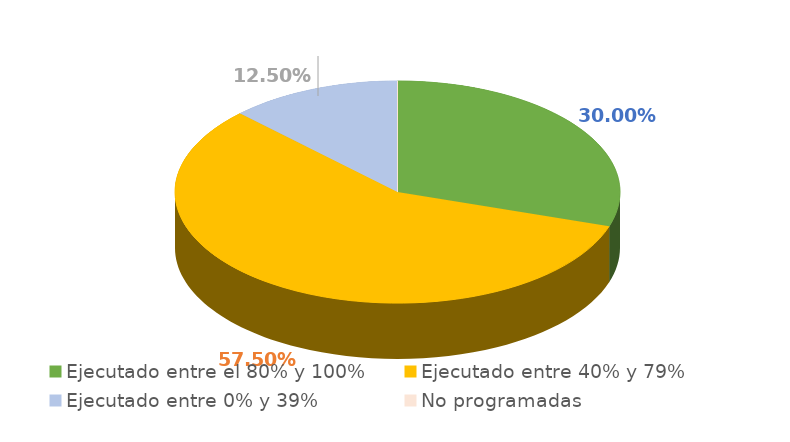
| Category | Series 0 |
|---|---|
| Ejecutado entre el 80% y 100% | 0.3 |
| Ejecutado entre 40% y 79% | 0.575 |
| Ejecutado entre 0% y 39% | 0.125 |
| No programadas | 0 |